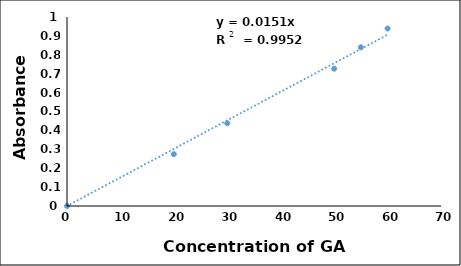
| Category | Series 0 |
|---|---|
| 0.0 | 0 |
| 20.0 | 0.274 |
| 30.0 | 0.438 |
| 50.0 | 0.727 |
| 55.0 | 0.84 |
| 60.0 | 0.939 |